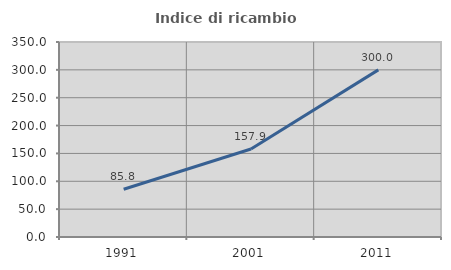
| Category | Indice di ricambio occupazionale  |
|---|---|
| 1991.0 | 85.756 |
| 2001.0 | 157.851 |
| 2011.0 | 300 |